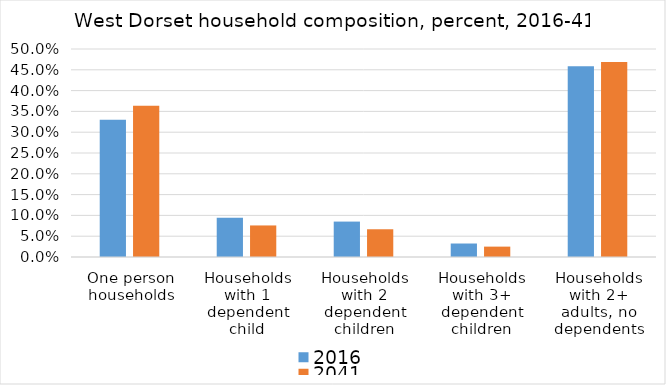
| Category | 2016 | 2041 |
|---|---|---|
| One person households | 0.33 | 0.364 |
| Households with 1 dependent child | 0.094 | 0.076 |
| Households with 2 dependent children | 0.085 | 0.067 |
| Households with 3+ dependent children | 0.032 | 0.025 |
| Households with 2+ adults, no dependents | 0.459 | 0.469 |